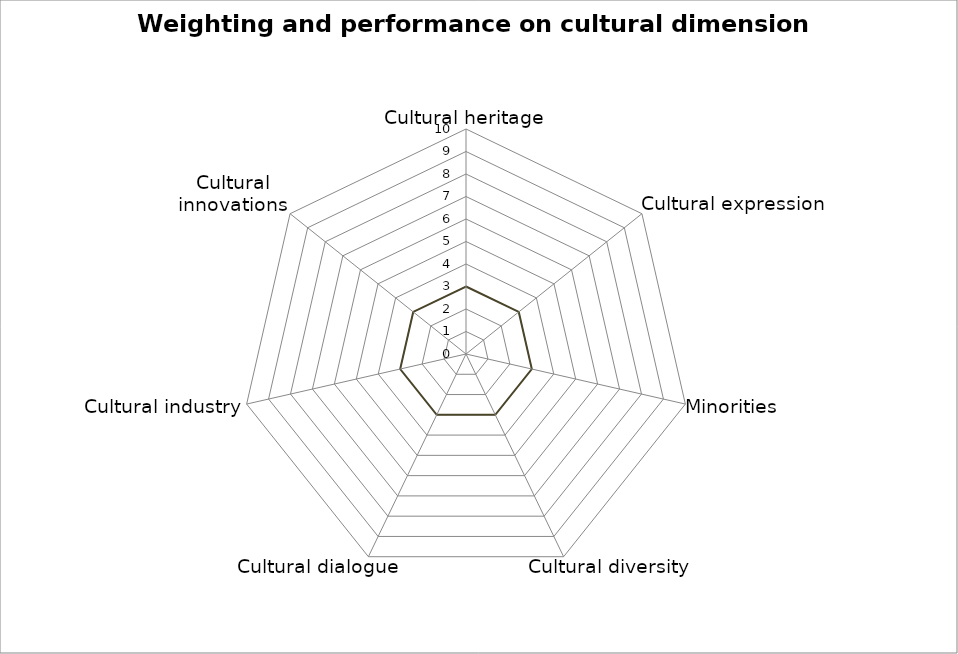
| Category | Performance | Weighting | Series 2 |
|---|---|---|---|
| Cultural heritage | 0 | 0 | 3 |
| Cultural expression | 0 | 0 | 3 |
| Minorities | 0 | 0 | 3 |
| Cultural diversity | 0 | 0 | 3 |
| Cultural dialogue | 0 | 0 | 3 |
| Cultural industry | 0 | 0 | 3 |
| Cultural innovations | 0 | 0 | 3 |